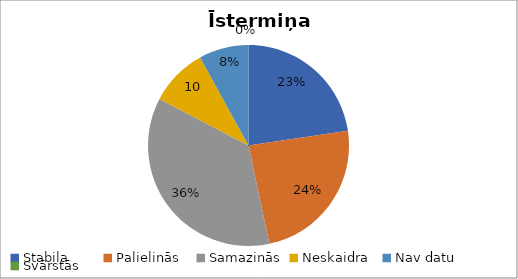
| Category | Īstermiņa (aizsargājamie) |
|---|---|
| Stabila | 17 |
| Palielinās | 18 |
| Samazinās | 27 |
| Neskaidra | 7 |
| Nav datu | 6 |
| Svārstās | 0 |